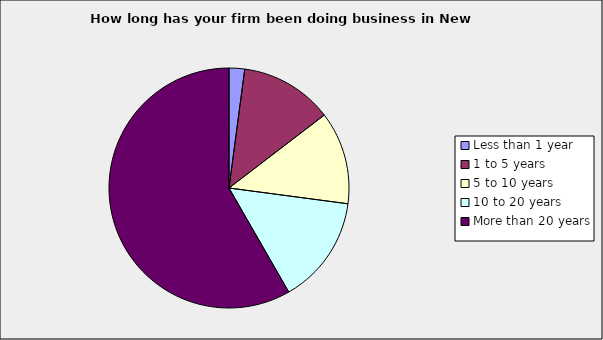
| Category | Series 0 |
|---|---|
| Less than 1 year | 0.021 |
| 1 to 5 years | 0.125 |
| 5 to 10 years | 0.125 |
| 10 to 20 years | 0.146 |
| More than 20 years | 0.583 |